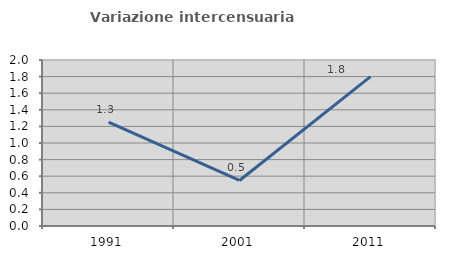
| Category | Variazione intercensuaria annua |
|---|---|
| 1991.0 | 1.252 |
| 2001.0 | 0.549 |
| 2011.0 | 1.8 |